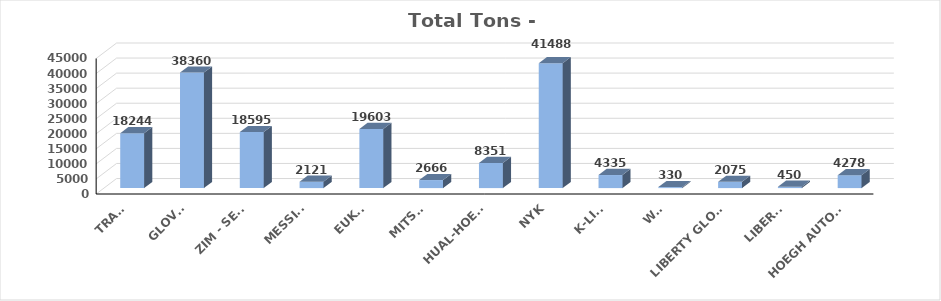
| Category | Series 0 |
|---|---|
| TRAMP | 18244 |
| GLOVIS | 38360 |
| ZIM - SETH | 18595 |
| MESSINA | 2121 |
| EUKOR | 19603 |
| MITSUI | 2666 |
| HUAL-HOEGH | 8351 |
| NYK | 41488 |
| K-LINE | 4335 |
| WWL | 330 |
| LIBERTY GLOBA | 2075 |
| LIBERTY | 450 |
| HOEGH AUTOLIN | 4278 |